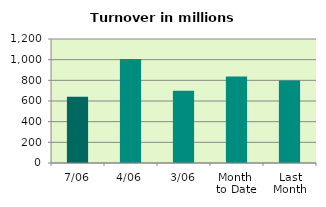
| Category | Series 0 |
|---|---|
| 7/06 | 640.123 |
| 4/06 | 1005.566 |
| 3/06 | 698.41 |
| Month 
to Date | 837.642 |
| Last
Month | 798.504 |